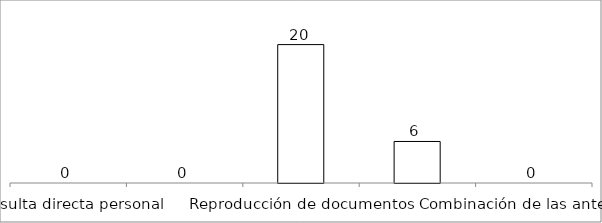
| Category | Series 0 |
|---|---|
| Consulta directa personal | 0 |
| Consulta directa electrónica | 0 |
| Reproducción de documentos | 20 |
| Elaboración de informes | 6 |
| Combinación de las anteriores | 0 |